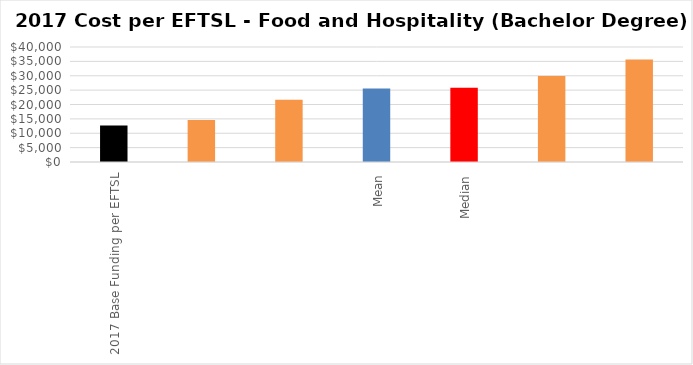
| Category | Series 0 |
|---|---|
| 2017 Base Funding per EFTSL | 12685 |
|  | 14590.006 |
|  | 21691.969 |
| Mean | 25528 |
| Median | 25799.928 |